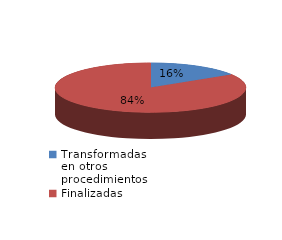
| Category | Series 0 |
|---|---|
| Transformadas en otros procedimientos | 3606 |
| Finalizadas | 18966 |